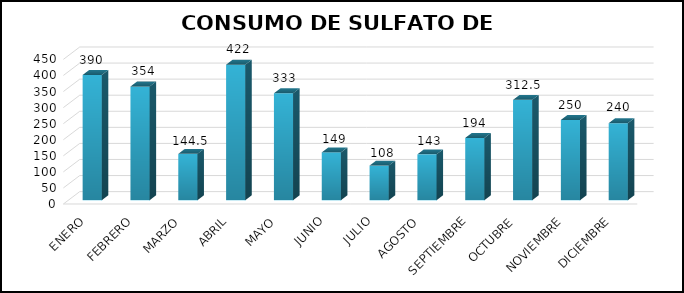
| Category | Series 0 |
|---|---|
| ENERO | 390 |
| FEBRERO | 354 |
| MARZO | 144.5 |
| ABRIL | 422 |
| MAYO | 333 |
| JUNIO | 149 |
| JULIO | 108 |
| AGOSTO | 143 |
| SEPTIEMBRE | 194 |
| OCTUBRE | 312.5 |
| NOVIEMBRE | 250 |
| DICIEMBRE | 240 |